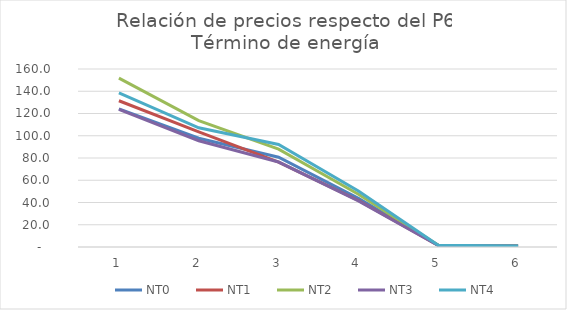
| Category | NT0 | NT1 | NT2 | NT3 | NT4 |
|---|---|---|---|---|---|
| 0 | 124.104 | 131.476 | 151.861 | 123.676 | 138.539 |
| 1 | 97.765 | 103.423 | 113.571 | 95.513 | 107.141 |
| 2 | 80.744 | 76.347 | 87.973 | 76.373 | 92.177 |
| 3 | 43.738 | 41.791 | 47.396 | 41.488 | 50.267 |
| 4 | 1.538 | 1.476 | 1.568 | 1.369 | 1.621 |
| 5 | 1 | 1 | 1 | 1 | 1 |